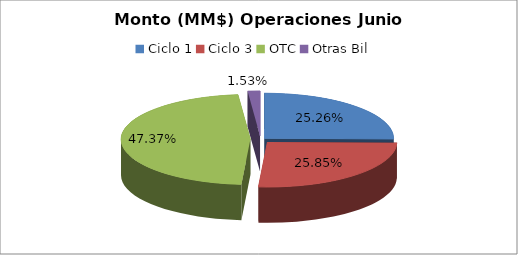
| Category | Series 0 |
|---|---|
| Ciclo 1 | 17653207.737 |
| Ciclo 3 | 18067976.125 |
| OTC | 33107498.911 |
| Otras Bil | 1069963.521 |